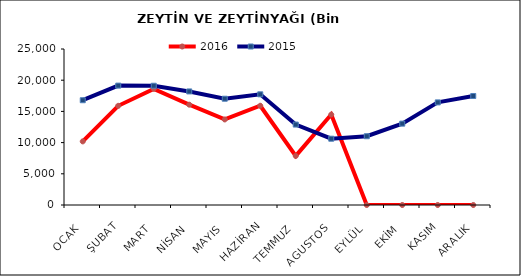
| Category | 2016 | 2015 |
|---|---|---|
| OCAK | 10191.508 | 16791.807 |
| ŞUBAT | 15895.203 | 19131.206 |
| MART | 18612.352 | 19111.99 |
| NİSAN | 16075.793 | 18199.157 |
| MAYIS | 13709.486 | 17030.153 |
| HAZİRAN | 15906.684 | 17736.84 |
| TEMMUZ | 7864.169 | 12890.333 |
| AGUSTOS | 14492.025 | 10622.041 |
| EYLÜL | 0 | 11021.521 |
| EKİM | 0 | 13036.694 |
| KASIM | 0 | 16443.222 |
| ARALIK | 0 | 17468.448 |